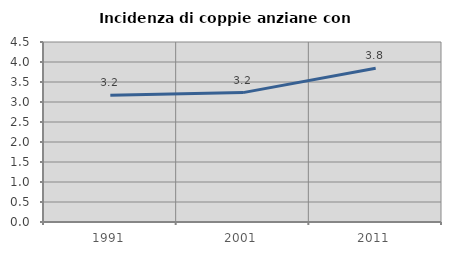
| Category | Incidenza di coppie anziane con figli |
|---|---|
| 1991.0 | 3.17 |
| 2001.0 | 3.235 |
| 2011.0 | 3.846 |